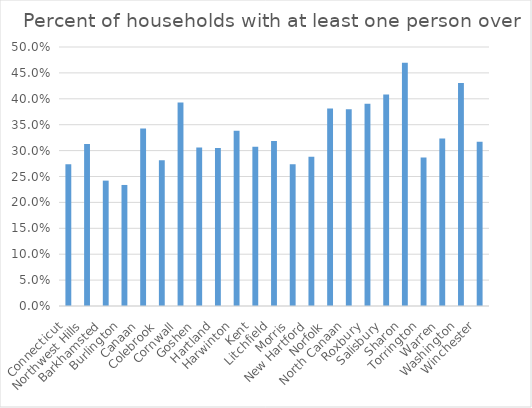
| Category | Percent of households with at least one person over 65 |
|---|---|
| Connecticut | 0.274 |
| Northwest Hills | 0.313 |
| Barkhamsted | 0.242 |
| Burlington | 0.234 |
| Canaan | 0.343 |
| Colebrook | 0.281 |
| Cornwall | 0.393 |
| Goshen | 0.306 |
| Hartland | 0.305 |
| Harwinton | 0.338 |
| Kent | 0.308 |
| Litchfield | 0.319 |
| Morris | 0.274 |
| New Hartford | 0.288 |
| Norfolk | 0.381 |
| North Canaan | 0.38 |
| Roxbury | 0.39 |
| Salisbury | 0.408 |
| Sharon | 0.469 |
| Torrington | 0.287 |
| Warren | 0.323 |
| Washington | 0.43 |
| Winchester | 0.317 |